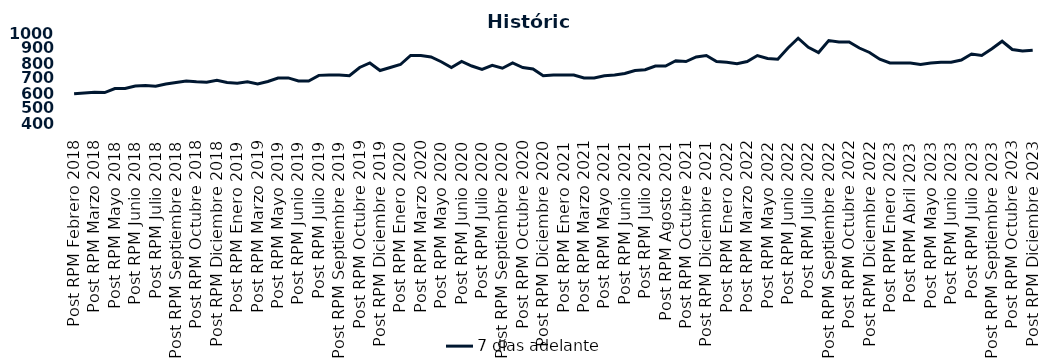
| Category | 7 días adelante  |
|---|---|
| Post RPM Febrero 2018 | 595 |
| Pre RPM Marzo 2018 | 600 |
| Post RPM Marzo 2018 | 605 |
| Pre RPM Mayo 2018 | 603 |
| Post RPM Mayo 2018 | 630 |
| Pre RPM Junio 2018 | 630 |
| Post RPM Junio 2018 | 646.5 |
| Pre RPM Julio 2018 | 650 |
| Post RPM Julio 2018 | 645 |
| Pre RPM Septiembre 2018 | 660 |
| Post RPM Septiembre 2018 | 670 |
| Pre RPM Octubre 2018 | 680 |
| Post RPM Octubre 2018 | 675 |
| Pre RPM Diciembre 2018 | 672.5 |
| Post RPM Diciembre 2018 | 685 |
| Pre RPM Enero 2019 | 670 |
| Post RPM Enero 2019 | 665 |
| Pre RPM Marzo 2019 | 675 |
| Post RPM Marzo 2019 | 661 |
| Pre RPM Mayo 2019 | 677 |
| Post RPM Mayo 2019 | 700 |
| Pre RPM Junio 2019 | 700.5 |
| Post RPM Junio 2019 | 680 |
| Pre RPM Julio 2019 | 680 |
| Post RPM Julio 2019 | 717.5 |
| Pre RPM Septiembre 2019 | 720 |
| Post RPM Septiembre 2019 | 720 |
| Pre RPM Octubre 2019 | 715 |
| Post RPM Octubre 2019 | 770 |
| Pre RPM Diciembre 2019 | 800 |
| Post RPM Diciembre 2019 | 750 |
| Pre RPM Enero 2020 | 770 |
| Post RPM Enero 2020 | 790 |
| Pre RPM Marzo 2020 | 850 |
| Post RPM Marzo 2020 | 850 |
| Pre RPM Mayo 2020 | 840 |
| Post RPM Mayo 2020 | 808.5 |
| Pre RPM Junio 2020 | 770 |
| Post RPM Junio 2020 | 810 |
| Pre RPM Julio 2020 | 780 |
| Post RPM Julio 2020 | 757 |
| Pre RPM Septiembre 2020 | 785 |
| Post RPM Septiembre 2020 | 765 |
| Pre RPM Octubre 2020 | 800 |
| Post RPM Octubre 2020 | 770 |
| Pre RPM Diciembre 2020 | 760 |
| Post RPM Diciembre 2020 | 715 |
| Pre RPM Enero 2021 | 720 |
| Post RPM Enero 2021 | 720 |
| Pre RPM Marzo 2021 | 720 |
| Post RPM Marzo 2021 | 700 |
| Pre RPM Mayo 2021 | 700 |
| Post RPM Mayo 2021 | 715 |
| Pre RPM Junio 2021 | 720 |
| Post RPM Junio 2021 | 730 |
| Pre RPM Julio 2021 | 750 |
| Post RPM Julio 2021 | 755 |
| Pre RPM Agosto 2021 | 780 |
| Post RPM Agosto 2021 | 780 |
| Pre RPM Octubre 2021 | 815 |
| Post RPM Octubre 2021 | 810 |
| Pre RPM Diciembre 2021 | 840 |
| Post RPM Diciembre 2021 | 850 |
| Pre RPM Enero 2022 | 810 |
| Post RPM Enero 2022 | 805 |
| Pre RPM Marzo 2022 | 795 |
| Post RPM Marzo 2022 | 810 |
| Pre RPM Mayo 2022 | 850 |
| Post RPM Mayo 2022 | 830 |
| Pre RPM Junio 2022 | 825 |
| Post RPM Junio 2022 | 900 |
| Pre RPM Julio 2022 | 965 |
| Post RPM Julio 2022 | 905 |
| Pre RPM Septiembre 2022 | 870 |
| Post RPM Septiembre 2022 | 950 |
| Pre RPM Octubre 2022 | 940 |
| Post RPM Octubre 2022 | 940 |
| Pre RPM Diciembre 2022 | 900 |
| Post RPM Diciembre 2022 | 870 |
| Pre RPM Enero 2023 | 825 |
| Post RPM Enero 2023 | 800 |
| Pre RPM Abril 2023 | 800 |
| Post RPM Abril 2023 | 800 |
| Pre RPM Mayo 2023 | 790 |
| Post RPM Mayo 2023 | 800 |
| Pre RPM Junio 2023 | 805 |
| Post RPM Junio 2023 | 805 |
| Pre RPM Julio 2023 | 820 |
| Post RPM Julio 2023 | 860 |
| Pre RPM Septiembre 2023 | 850 |
| Post RPM Septiembre 2023 | 895 |
| Pre RPM Octubre 2023 | 945 |
| Post RPM Octubre 2023 | 890 |
| Pre RPM Diciembre 2023 | 880 |
| Post RPM Diciembre 2023 | 885 |